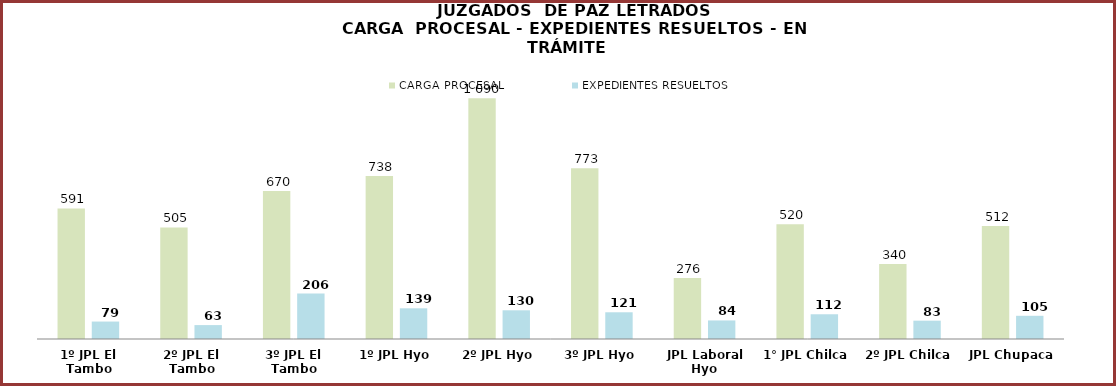
| Category | CARGA PROCESAL | EXPEDIENTES RESUELTOS |
|---|---|---|
| 1º JPL El Tambo | 591 | 79 |
| 2º JPL El Tambo | 505 | 63 |
| 3º JPL El Tambo | 670 | 206 |
| 1º JPL Hyo | 738 | 139 |
| 2º JPL Hyo | 1090 | 130 |
| 3º JPL Hyo | 773 | 121 |
| JPL Laboral Hyo | 276 | 84 |
| 1° JPL Chilca | 520 | 112 |
| 2º JPL Chilca | 340 | 83 |
| JPL Chupaca | 512 | 105 |